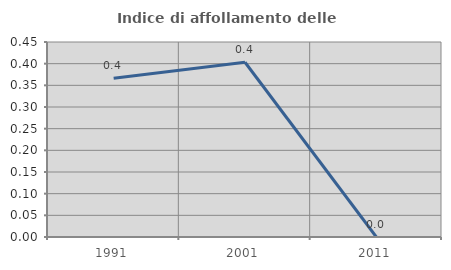
| Category | Indice di affollamento delle abitazioni  |
|---|---|
| 1991.0 | 0.366 |
| 2001.0 | 0.403 |
| 2011.0 | 0 |